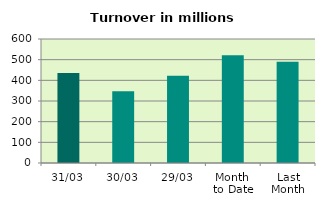
| Category | Series 0 |
|---|---|
| 31/03 | 435.876 |
| 30/03 | 346.739 |
| 29/03 | 422.481 |
| Month 
to Date | 521.26 |
| Last
Month | 490.433 |